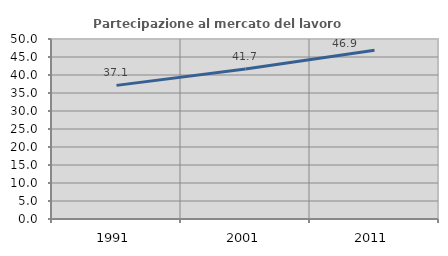
| Category | Partecipazione al mercato del lavoro  femminile |
|---|---|
| 1991.0 | 37.118 |
| 2001.0 | 41.659 |
| 2011.0 | 46.884 |